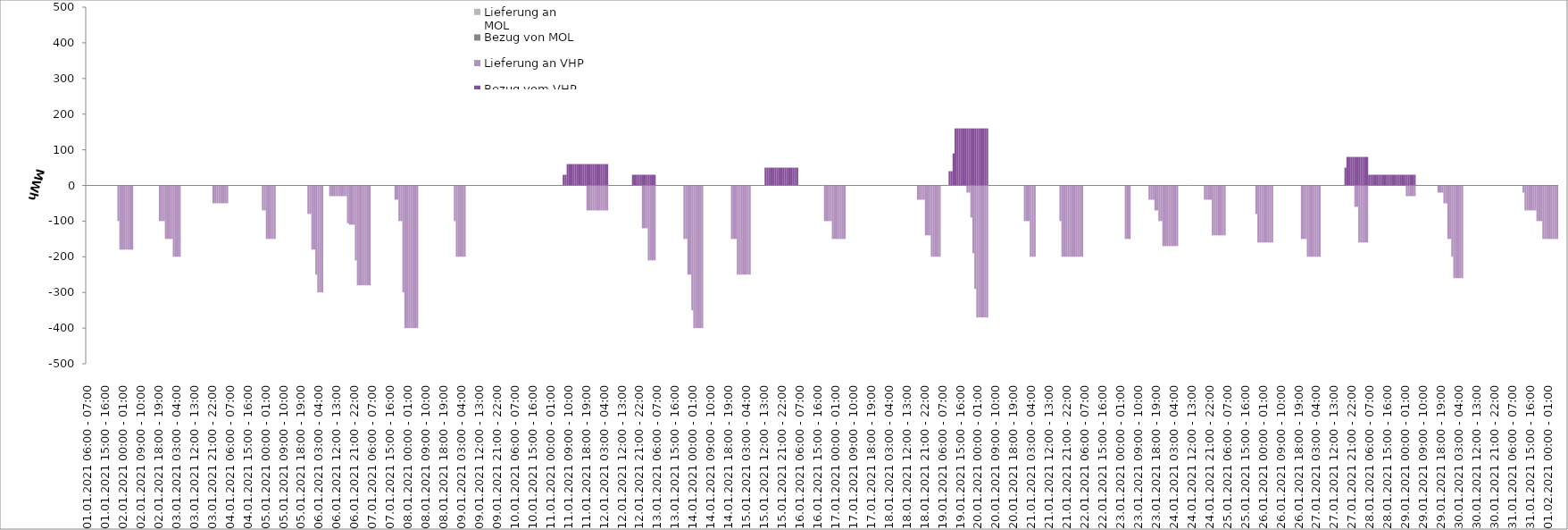
| Category | Bezug vom VHP | Lieferung an VHP | Bezug von MOL | Lieferung an MOL |
|---|---|---|---|---|
| 01.01.2021 06:00 - 07:00 | 0 | 0 | 0 | 0 |
| 01.01.2021 07:00 - 08:00 | 0 | 0 | 0 | 0 |
| 01.01.2021 08:00 - 09:00 | 0 | 0 | 0 | 0 |
| 01.01.2021 09:00 - 10:00 | 0 | 0 | 0 | 0 |
| 01.01.2021 10:00 - 11:00 | 0 | 0 | 0 | 0 |
| 01.01.2021 11:00 - 12:00 | 0 | 0 | 0 | 0 |
| 01.01.2021 12:00 - 13:00 | 0 | 0 | 0 | 0 |
| 01.01.2021 13:00 - 14:00 | 0 | 0 | 0 | 0 |
| 01.01.2021 14:00 - 15:00 | 0 | 0 | 0 | 0 |
| 01.01.2021 15:00 - 16:00 | 0 | 0 | 0 | 0 |
| 01.01.2021 16:00 - 17:00 | 0 | 0 | 0 | 0 |
| 01.01.2021 17:00 - 18:00 | 0 | 0 | 0 | 0 |
| 01.01.2021 18:00 - 19:00 | 0 | 0 | 0 | 0 |
| 01.01.2021 19:00 - 20:00 | 0 | 0 | 0 | 0 |
| 01.01.2021 20:00 - 21:00 | 0 | 0 | 0 | 0 |
| 01.01.2021 21:00 - 22:00 | 0 | 0 | 0 | 0 |
| 01.01.2021 22:00 - 23:00 | 0 | -100 | 0 | 0 |
| 01.01.2021 23:00 - 24:00 | 0 | -180 | 0 | 0 |
| 02.01.2021 00:00 - 01:00 | 0 | -180 | 0 | 0 |
| 02.01.2021 01:00 - 02:00 | 0 | -180 | 0 | 0 |
| 02.01.2021 02:00 - 03:00 | 0 | -180 | 0 | 0 |
| 02.01.2021 03:00 - 04:00 | 0 | -180 | 0 | 0 |
| 02.01.2021 04:00 - 05:00 | 0 | -180 | 0 | 0 |
| 02.01.2021 05:00 - 06:00 | 0 | -180 | 0 | 0 |
| 02.01.2021 06:00 - 07:00 | 0 | 0 | 0 | 0 |
| 02.01.2021 07:00 - 08:00 | 0 | 0 | 0 | 0 |
| 02.01.2021 08:00 - 09:00 | 0 | 0 | 0 | 0 |
| 02.01.2021 09:00 - 10:00 | 0 | 0 | 0 | 0 |
| 02.01.2021 10:00 - 11:00 | 0 | 0 | 0 | 0 |
| 02.01.2021 11:00 - 12:00 | 0 | 0 | 0 | 0 |
| 02.01.2021 12:00 - 13:00 | 0 | 0 | 0 | 0 |
| 02.01.2021 13:00 - 14:00 | 0 | 0 | 0 | 0 |
| 02.01.2021 14:00 - 15:00 | 0 | 0 | 0 | 0 |
| 02.01.2021 15:00 - 16:00 | 0 | 0 | 0 | 0 |
| 02.01.2021 16:00 - 17:00 | 0 | 0 | 0 | 0 |
| 02.01.2021 17:00 - 18:00 | 0 | 0 | 0 | 0 |
| 02.01.2021 18:00 - 19:00 | 0 | 0 | 0 | 0 |
| 02.01.2021 19:00 - 20:00 | 0 | -100 | 0 | 0 |
| 02.01.2021 20:00 - 21:00 | 0 | -100 | 0 | 0 |
| 02.01.2021 21:00 - 22:00 | 0 | -100 | 0 | 0 |
| 02.01.2021 22:00 - 23:00 | 0 | -150 | 0 | 0 |
| 02.01.2021 23:00 - 24:00 | 0 | -150 | 0 | 0 |
| 03.01.2021 00:00 - 01:00 | 0 | -150 | 0 | 0 |
| 03.01.2021 01:00 - 02:00 | 0 | -150 | 0 | 0 |
| 03.01.2021 02:00 - 03:00 | 0 | -200 | 0 | 0 |
| 03.01.2021 03:00 - 04:00 | 0 | -200 | 0 | 0 |
| 03.01.2021 04:00 - 05:00 | 0 | -200 | 0 | 0 |
| 03.01.2021 05:00 - 06:00 | 0 | -200 | 0 | 0 |
| 03.01.2021 06:00 - 07:00 | 0 | 0 | 0 | 0 |
| 03.01.2021 07:00 - 08:00 | 0 | 0 | 0 | 0 |
| 03.01.2021 08:00 - 09:00 | 0 | 0 | 0 | 0 |
| 03.01.2021 09:00 - 10:00 | 0 | 0 | 0 | 0 |
| 03.01.2021 10:00 - 11:00 | 0 | 0 | 0 | 0 |
| 03.01.2021 11:00 - 12:00 | 0 | 0 | 0 | 0 |
| 03.01.2021 12:00 - 13:00 | 0 | 0 | 0 | 0 |
| 03.01.2021 13:00 - 14:00 | 0 | 0 | 0 | 0 |
| 03.01.2021 14:00 - 15:00 | 0 | 0 | 0 | 0 |
| 03.01.2021 15:00 - 16:00 | 0 | 0 | 0 | 0 |
| 03.01.2021 16:00 - 17:00 | 0 | 0 | 0 | 0 |
| 03.01.2021 17:00 - 18:00 | 0 | 0 | 0 | 0 |
| 03.01.2021 18:00 - 19:00 | 0 | 0 | 0 | 0 |
| 03.01.2021 19:00 - 20:00 | 0 | 0 | 0 | 0 |
| 03.01.2021 20:00 - 21:00 | 0 | 0 | 0 | 0 |
| 03.01.2021 21:00 - 22:00 | 0 | 0 | 0 | 0 |
| 03.01.2021 22:00 - 23:00 | 0 | -50 | 0 | 0 |
| 03.01.2021 23:00 - 24:00 | 0 | -50 | 0 | 0 |
| 04.01.2021 00:00 - 01:00 | 0 | -50 | 0 | 0 |
| 04.01.2021 01:00 - 02:00 | 0 | -50 | 0 | 0 |
| 04.01.2021 02:00 - 03:00 | 0 | -50 | 0 | 0 |
| 04.01.2021 03:00 - 04:00 | 0 | -50 | 0 | 0 |
| 04.01.2021 04:00 - 05:00 | 0 | -50 | 0 | 0 |
| 04.01.2021 05:00 - 06:00 | 0 | -50 | 0 | 0 |
| 04.01.2021 06:00 - 07:00 | 0 | 0 | 0 | 0 |
| 04.01.2021 07:00 - 08:00 | 0 | 0 | 0 | 0 |
| 04.01.2021 08:00 - 09:00 | 0 | 0 | 0 | 0 |
| 04.01.2021 09:00 - 10:00 | 0 | 0 | 0 | 0 |
| 04.01.2021 10:00 - 11:00 | 0 | 0 | 0 | 0 |
| 04.01.2021 11:00 - 12:00 | 0 | 0 | 0 | 0 |
| 04.01.2021 12:00 - 13:00 | 0 | 0 | 0 | 0 |
| 04.01.2021 13:00 - 14:00 | 0 | 0 | 0 | 0 |
| 04.01.2021 14:00 - 15:00 | 0 | 0 | 0 | 0 |
| 04.01.2021 15:00 - 16:00 | 0 | 0 | 0 | 0 |
| 04.01.2021 16:00 - 17:00 | 0 | 0 | 0 | 0 |
| 04.01.2021 17:00 - 18:00 | 0 | 0 | 0 | 0 |
| 04.01.2021 18:00 - 19:00 | 0 | 0 | 0 | 0 |
| 04.01.2021 19:00 - 20:00 | 0 | 0 | 0 | 0 |
| 04.01.2021 20:00 - 21:00 | 0 | 0 | 0 | 0 |
| 04.01.2021 21:00 - 22:00 | 0 | 0 | 0 | 0 |
| 04.01.2021 22:00 - 23:00 | 0 | 0 | 0 | 0 |
| 04.01.2021 23:00 - 24:00 | 0 | -70 | 0 | 0 |
| 05.01.2021 00:00 - 01:00 | 0 | -70 | 0 | 0 |
| 05.01.2021 01:00 - 02:00 | 0 | -150 | 0 | 0 |
| 05.01.2021 02:00 - 03:00 | 0 | -150 | 0 | 0 |
| 05.01.2021 03:00 - 04:00 | 0 | -150 | 0 | 0 |
| 05.01.2021 04:00 - 05:00 | 0 | -150 | 0 | 0 |
| 05.01.2021 05:00 - 06:00 | 0 | -150 | 0 | 0 |
| 05.01.2021 06:00 - 07:00 | 0 | 0 | 0 | 0 |
| 05.01.2021 07:00 - 08:00 | 0 | 0 | 0 | 0 |
| 05.01.2021 08:00 - 09:00 | 0 | 0 | 0 | 0 |
| 05.01.2021 09:00 - 10:00 | 0 | 0 | 0 | 0 |
| 05.01.2021 10:00 - 11:00 | 0 | 0 | 0 | 0 |
| 05.01.2021 11:00 - 12:00 | 0 | 0 | 0 | 0 |
| 05.01.2021 12:00 - 13:00 | 0 | 0 | 0 | 0 |
| 05.01.2021 13:00 - 14:00 | 0 | 0 | 0 | 0 |
| 05.01.2021 14:00 - 15:00 | 0 | 0 | 0 | 0 |
| 05.01.2021 15:00 - 16:00 | 0 | 0 | 0 | 0 |
| 05.01.2021 16:00 - 17:00 | 0 | 0 | 0 | 0 |
| 05.01.2021 17:00 - 18:00 | 0 | 0 | 0 | 0 |
| 05.01.2021 18:00 - 19:00 | 0 | 0 | 0 | 0 |
| 05.01.2021 19:00 - 20:00 | 0 | 0 | 0 | 0 |
| 05.01.2021 20:00 - 21:00 | 0 | 0 | 0 | 0 |
| 05.01.2021 21:00 - 22:00 | 0 | 0 | 0 | 0 |
| 05.01.2021 22:00 - 23:00 | 0 | -80 | 0 | 0 |
| 05.01.2021 23:00 - 24:00 | 0 | -80 | 0 | 0 |
| 06.01.2021 00:00 - 01:00 | 0 | -180 | 0 | 0 |
| 06.01.2021 01:00 - 02:00 | 0 | -180 | 0 | 0 |
| 06.01.2021 02:00 - 03:00 | 0 | -250 | 0 | 0 |
| 06.01.2021 03:00 - 04:00 | 0 | -300 | 0 | 0 |
| 06.01.2021 04:00 - 05:00 | 0 | -300 | 0 | 0 |
| 06.01.2021 05:00 - 06:00 | 0 | -300 | 0 | 0 |
| 06.01.2021 06:00 - 07:00 | 0 | 0 | 0 | 0 |
| 06.01.2021 07:00 - 08:00 | 0 | 0 | 0 | 0 |
| 06.01.2021 08:00 - 09:00 | 0 | 0 | 0 | 0 |
| 06.01.2021 09:00 - 10:00 | 0 | -30 | 0 | 0 |
| 06.01.2021 10:00 - 11:00 | 0 | -30 | 0 | 0 |
| 06.01.2021 11:00 - 12:00 | 0 | -30 | 0 | 0 |
| 06.01.2021 12:00 - 13:00 | 0 | -30 | 0 | 0 |
| 06.01.2021 13:00 - 14:00 | 0 | -30 | 0 | 0 |
| 06.01.2021 14:00 - 15:00 | 0 | -30 | 0 | 0 |
| 06.01.2021 15:00 - 16:00 | 0 | -30 | 0 | 0 |
| 06.01.2021 16:00 - 17:00 | 0 | -30 | 0 | 0 |
| 06.01.2021 17:00 - 18:00 | 0 | -30 | 0 | 0 |
| 06.01.2021 18:00 - 19:00 | 0 | -106 | 0 | 0 |
| 06.01.2021 19:00 - 20:00 | 0 | -110 | 0 | 0 |
| 06.01.2021 20:00 - 21:00 | 0 | -110 | 0 | 0 |
| 06.01.2021 21:00 - 22:00 | 0 | -110 | 0 | 0 |
| 06.01.2021 22:00 - 23:00 | 0 | -210 | 0 | 0 |
| 06.01.2021 23:00 - 24:00 | 0 | -280 | 0 | 0 |
| 07.01.2021 00:00 - 01:00 | 0 | -280 | 0 | 0 |
| 07.01.2021 01:00 - 02:00 | 0 | -280 | 0 | 0 |
| 07.01.2021 02:00 - 03:00 | 0 | -280 | 0 | 0 |
| 07.01.2021 03:00 - 04:00 | 0 | -280 | 0 | 0 |
| 07.01.2021 04:00 - 05:00 | 0 | -280 | 0 | 0 |
| 07.01.2021 05:00 - 06:00 | 0 | -280 | 0 | 0 |
| 07.01.2021 06:00 - 07:00 | 0 | 0 | 0 | 0 |
| 07.01.2021 07:00 - 08:00 | 0 | 0 | 0 | 0 |
| 07.01.2021 08:00 - 09:00 | 0 | 0 | 0 | 0 |
| 07.01.2021 09:00 - 10:00 | 0 | 0 | 0 | 0 |
| 07.01.2021 10:00 - 11:00 | 0 | 0 | 0 | 0 |
| 07.01.2021 11:00 - 12:00 | 0 | 0 | 0 | 0 |
| 07.01.2021 12:00 - 13:00 | 0 | 0 | 0 | 0 |
| 07.01.2021 13:00 - 14:00 | 0 | 0 | 0 | 0 |
| 07.01.2021 14:00 - 15:00 | 0 | 0 | 0 | 0 |
| 07.01.2021 15:00 - 16:00 | 0 | 0 | 0 | 0 |
| 07.01.2021 16:00 - 17:00 | 0 | 0 | 0 | 0 |
| 07.01.2021 17:00 - 18:00 | 0 | 0 | 0 | 0 |
| 07.01.2021 18:00 - 19:00 | 0 | -40 | 0 | 0 |
| 07.01.2021 19:00 - 20:00 | 0 | -40 | 0 | 0 |
| 07.01.2021 20:00 - 21:00 | 0 | -100 | 0 | 0 |
| 07.01.2021 21:00 - 22:00 | 0 | -100 | 0 | 0 |
| 07.01.2021 22:00 - 23:00 | 0 | -300 | 0 | 0 |
| 07.01.2021 23:00 - 24:00 | 0 | -400 | 0 | 0 |
| 08.01.2021 00:00 - 01:00 | 0 | -400 | 0 | 0 |
| 08.01.2021 01:00 - 02:00 | 0 | -400 | 0 | 0 |
| 08.01.2021 02:00 - 03:00 | 0 | -400 | 0 | 0 |
| 08.01.2021 03:00 - 04:00 | 0 | -400 | 0 | 0 |
| 08.01.2021 04:00 - 05:00 | 0 | -400 | 0 | 0 |
| 08.01.2021 05:00 - 06:00 | 0 | -400 | 0 | 0 |
| 08.01.2021 06:00 - 07:00 | 0 | 0 | 0 | 0 |
| 08.01.2021 07:00 - 08:00 | 0 | 0 | 0 | 0 |
| 08.01.2021 08:00 - 09:00 | 0 | 0 | 0 | 0 |
| 08.01.2021 09:00 - 10:00 | 0 | 0 | 0 | 0 |
| 08.01.2021 10:00 - 11:00 | 0 | 0 | 0 | 0 |
| 08.01.2021 11:00 - 12:00 | 0 | 0 | 0 | 0 |
| 08.01.2021 12:00 - 13:00 | 0 | 0 | 0 | 0 |
| 08.01.2021 13:00 - 14:00 | 0 | 0 | 0 | 0 |
| 08.01.2021 14:00 - 15:00 | 0 | 0 | 0 | 0 |
| 08.01.2021 15:00 - 16:00 | 0 | 0 | 0 | 0 |
| 08.01.2021 16:00 - 17:00 | 0 | 0 | 0 | 0 |
| 08.01.2021 17:00 - 18:00 | 0 | 0 | 0 | 0 |
| 08.01.2021 18:00 - 19:00 | 0 | 0 | 0 | 0 |
| 08.01.2021 19:00 - 20:00 | 0 | 0 | 0 | 0 |
| 08.01.2021 20:00 - 21:00 | 0 | 0 | 0 | 0 |
| 08.01.2021 21:00 - 22:00 | 0 | 0 | 0 | 0 |
| 08.01.2021 22:00 - 23:00 | 0 | 0 | 0 | 0 |
| 08.01.2021 23:00 - 24:00 | 0 | 0 | 0 | 0 |
| 09.01.2021 00:00 - 01:00 | 0 | -100 | 0 | 0 |
| 09.01.2021 01:00 - 02:00 | 0 | -200 | 0 | 0 |
| 09.01.2021 02:00 - 03:00 | 0 | -200 | 0 | 0 |
| 09.01.2021 03:00 - 04:00 | 0 | -200 | 0 | 0 |
| 09.01.2021 04:00 - 05:00 | 0 | -200 | 0 | 0 |
| 09.01.2021 05:00 - 06:00 | 0 | -200 | 0 | 0 |
| 09.01.2021 06:00 - 07:00 | 0 | 0 | 0 | 0 |
| 09.01.2021 07:00 - 08:00 | 0 | 0 | 0 | 0 |
| 09.01.2021 08:00 - 09:00 | 0 | 0 | 0 | 0 |
| 09.01.2021 09:00 - 10:00 | 0 | 0 | 0 | 0 |
| 09.01.2021 10:00 - 11:00 | 0 | 0 | 0 | 0 |
| 09.01.2021 11:00 - 12:00 | 0 | 0 | 0 | 0 |
| 09.01.2021 12:00 - 13:00 | 0 | 0 | 0 | 0 |
| 09.01.2021 13:00 - 14:00 | 0 | 0 | 0 | 0 |
| 09.01.2021 14:00 - 15:00 | 0 | 0 | 0 | 0 |
| 09.01.2021 15:00 - 16:00 | 0 | 0 | 0 | 0 |
| 09.01.2021 16:00 - 17:00 | 0 | 0 | 0 | 0 |
| 09.01.2021 17:00 - 18:00 | 0 | 0 | 0 | 0 |
| 09.01.2021 18:00 - 19:00 | 0 | 0 | 0 | 0 |
| 09.01.2021 19:00 - 20:00 | 0 | 0 | 0 | 0 |
| 09.01.2021 20:00 - 21:00 | 0 | 0 | 0 | 0 |
| 09.01.2021 21:00 - 22:00 | 0 | 0 | 0 | 0 |
| 09.01.2021 22:00 - 23:00 | 0 | 0 | 0 | 0 |
| 09.01.2021 23:00 - 24:00 | 0 | 0 | 0 | 0 |
| 10.01.2021 00:00 - 01:00 | 0 | 0 | 0 | 0 |
| 10.01.2021 01:00 - 02:00 | 0 | 0 | 0 | 0 |
| 10.01.2021 02:00 - 03:00 | 0 | 0 | 0 | 0 |
| 10.01.2021 03:00 - 04:00 | 0 | 0 | 0 | 0 |
| 10.01.2021 04:00 - 05:00 | 0 | 0 | 0 | 0 |
| 10.01.2021 05:00 - 06:00 | 0 | 0 | 0 | 0 |
| 10.01.2021 06:00 - 07:00 | 0 | 0 | 0 | 0 |
| 10.01.2021 07:00 - 08:00 | 0 | 0 | 0 | 0 |
| 10.01.2021 08:00 - 09:00 | 0 | 0 | 0 | 0 |
| 10.01.2021 09:00 - 10:00 | 0 | 0 | 0 | 0 |
| 10.01.2021 10:00 - 11:00 | 0 | 0 | 0 | 0 |
| 10.01.2021 11:00 - 12:00 | 0 | 0 | 0 | 0 |
| 10.01.2021 12:00 - 13:00 | 0 | 0 | 0 | 0 |
| 10.01.2021 13:00 - 14:00 | 0 | 0 | 0 | 0 |
| 10.01.2021 14:00 - 15:00 | 0 | 0 | 0 | 0 |
| 10.01.2021 15:00 - 16:00 | 0 | 0 | 0 | 0 |
| 10.01.2021 16:00 - 17:00 | 0 | 0 | 0 | 0 |
| 10.01.2021 17:00 - 18:00 | 0 | 0 | 0 | 0 |
| 10.01.2021 18:00 - 19:00 | 0 | 0 | 0 | 0 |
| 10.01.2021 19:00 - 20:00 | 0 | 0 | 0 | 0 |
| 10.01.2021 20:00 - 21:00 | 0 | 0 | 0 | 0 |
| 10.01.2021 21:00 - 22:00 | 0 | 0 | 0 | 0 |
| 10.01.2021 22:00 - 23:00 | 0 | 0 | 0 | 0 |
| 10.01.2021 23:00 - 24:00 | 0 | 0 | 0 | 0 |
| 11.01.2021 00:00 - 01:00 | 0 | 0 | 0 | 0 |
| 11.01.2021 01:00 - 02:00 | 0 | 0 | 0 | 0 |
| 11.01.2021 02:00 - 03:00 | 0 | 0 | 0 | 0 |
| 11.01.2021 03:00 - 04:00 | 0 | 0 | 0 | 0 |
| 11.01.2021 04:00 - 05:00 | 0 | 0 | 0 | 0 |
| 11.01.2021 05:00 - 06:00 | 0 | 0 | 0 | 0 |
| 11.01.2021 06:00 - 07:00 | 0 | 0 | 0 | 0 |
| 11.01.2021 07:00 - 08:00 | 30 | 0 | 0 | 0 |
| 11.01.2021 08:00 - 09:00 | 30 | 0 | 0 | 0 |
| 11.01.2021 09:00 - 10:00 | 60 | 0 | 0 | 0 |
| 11.01.2021 10:00 - 11:00 | 60 | 0 | 0 | 0 |
| 11.01.2021 11:00 - 12:00 | 60 | 0 | 0 | 0 |
| 11.01.2021 12:00 - 13:00 | 60 | 0 | 0 | 0 |
| 11.01.2021 13:00 - 14:00 | 60 | 0 | 0 | 0 |
| 11.01.2021 14:00 - 15:00 | 60 | 0 | 0 | 0 |
| 11.01.2021 15:00 - 16:00 | 60 | 0 | 0 | 0 |
| 11.01.2021 16:00 - 17:00 | 60 | 0 | 0 | 0 |
| 11.01.2021 17:00 - 18:00 | 60 | 0 | 0 | 0 |
| 11.01.2021 18:00 - 19:00 | 60 | 0 | 0 | 0 |
| 11.01.2021 19:00 - 20:00 | 60 | -70 | 0 | 0 |
| 11.01.2021 20:00 - 21:00 | 60 | -70 | 0 | 0 |
| 11.01.2021 21:00 - 22:00 | 60 | -70 | 0 | 0 |
| 11.01.2021 22:00 - 23:00 | 60 | -70 | 0 | 0 |
| 11.01.2021 23:00 - 24:00 | 60 | -70 | 0 | 0 |
| 12.01.2021 00:00 - 01:00 | 60 | -70 | 0 | 0 |
| 12.01.2021 01:00 - 02:00 | 60 | -70 | 0 | 0 |
| 12.01.2021 02:00 - 03:00 | 60 | -70 | 0 | 0 |
| 12.01.2021 03:00 - 04:00 | 60 | -70 | 0 | 0 |
| 12.01.2021 04:00 - 05:00 | 60 | -70 | 0 | 0 |
| 12.01.2021 05:00 - 06:00 | 60 | -70 | 0 | 0 |
| 12.01.2021 06:00 - 07:00 | 0 | 0 | 0 | 0 |
| 12.01.2021 07:00 - 08:00 | 0 | 0 | 0 | 0 |
| 12.01.2021 08:00 - 09:00 | 0 | 0 | 0 | 0 |
| 12.01.2021 09:00 - 10:00 | 0 | 0 | 0 | 0 |
| 12.01.2021 10:00 - 11:00 | 0 | 0 | 0 | 0 |
| 12.01.2021 11:00 - 12:00 | 0 | 0 | 0 | 0 |
| 12.01.2021 12:00 - 13:00 | 0 | 0 | 0 | 0 |
| 12.01.2021 13:00 - 14:00 | 0 | 0 | 0 | 0 |
| 12.01.2021 14:00 - 15:00 | 0 | 0 | 0 | 0 |
| 12.01.2021 15:00 - 16:00 | 0 | 0 | 0 | 0 |
| 12.01.2021 16:00 - 17:00 | 0 | 0 | 0 | 0 |
| 12.01.2021 17:00 - 18:00 | 0 | 0 | 0 | 0 |
| 12.01.2021 18:00 - 19:00 | 30 | 0 | 0 | 0 |
| 12.01.2021 19:00 - 20:00 | 30 | 0 | 0 | 0 |
| 12.01.2021 20:00 - 21:00 | 30 | 0 | 0 | 0 |
| 12.01.2021 21:00 - 22:00 | 30 | 0 | 0 | 0 |
| 12.01.2021 22:00 - 23:00 | 30 | 0 | 0 | 0 |
| 12.01.2021 23:00 - 24:00 | 30 | -120 | 0 | 0 |
| 13.01.2021 00:00 - 01:00 | 30 | -120 | 0 | 0 |
| 13.01.2021 01:00 - 02:00 | 30 | -120 | 0 | 0 |
| 13.01.2021 02:00 - 03:00 | 30 | -210 | 0 | 0 |
| 13.01.2021 03:00 - 04:00 | 30 | -210 | 0 | 0 |
| 13.01.2021 04:00 - 05:00 | 30 | -210 | 0 | 0 |
| 13.01.2021 05:00 - 06:00 | 30 | -210 | 0 | 0 |
| 13.01.2021 06:00 - 07:00 | 0 | 0 | 0 | 0 |
| 13.01.2021 07:00 - 08:00 | 0 | 0 | 0 | 0 |
| 13.01.2021 08:00 - 09:00 | 0 | 0 | 0 | 0 |
| 13.01.2021 09:00 - 10:00 | 0 | 0 | 0 | 0 |
| 13.01.2021 10:00 - 11:00 | 0 | 0 | 0 | 0 |
| 13.01.2021 11:00 - 12:00 | 0 | 0 | 0 | 0 |
| 13.01.2021 12:00 - 13:00 | 0 | 0 | 0 | 0 |
| 13.01.2021 13:00 - 14:00 | 0 | 0 | 0 | 0 |
| 13.01.2021 14:00 - 15:00 | 0 | 0 | 0 | 0 |
| 13.01.2021 15:00 - 16:00 | 0 | 0 | 0 | 0 |
| 13.01.2021 16:00 - 17:00 | 0 | 0 | 0 | 0 |
| 13.01.2021 17:00 - 18:00 | 0 | 0 | 0 | 0 |
| 13.01.2021 18:00 - 19:00 | 0 | 0 | 0 | 0 |
| 13.01.2021 19:00 - 20:00 | 0 | 0 | 0 | 0 |
| 13.01.2021 20:00 - 21:00 | 0 | -150 | 0 | 0 |
| 13.01.2021 21:00 - 22:00 | 0 | -150 | 0 | 0 |
| 13.01.2021 22:00 - 23:00 | 0 | -250 | 0 | 0 |
| 13.01.2021 23:00 - 24:00 | 0 | -250 | 0 | 0 |
| 14.01.2021 00:00 - 01:00 | 0 | -350 | 0 | 0 |
| 14.01.2021 01:00 - 02:00 | 0 | -400 | 0 | 0 |
| 14.01.2021 02:00 - 03:00 | 0 | -400 | 0 | 0 |
| 14.01.2021 03:00 - 04:00 | 0 | -400 | 0 | 0 |
| 14.01.2021 04:00 - 05:00 | 0 | -400 | 0 | 0 |
| 14.01.2021 05:00 - 06:00 | 0 | -400 | 0 | 0 |
| 14.01.2021 06:00 - 07:00 | 0 | 0 | 0 | 0 |
| 14.01.2021 07:00 - 08:00 | 0 | 0 | 0 | 0 |
| 14.01.2021 08:00 - 09:00 | 0 | 0 | 0 | 0 |
| 14.01.2021 09:00 - 10:00 | 0 | 0 | 0 | 0 |
| 14.01.2021 10:00 - 11:00 | 0 | 0 | 0 | 0 |
| 14.01.2021 11:00 - 12:00 | 0 | 0 | 0 | 0 |
| 14.01.2021 12:00 - 13:00 | 0 | 0 | 0 | 0 |
| 14.01.2021 13:00 - 14:00 | 0 | 0 | 0 | 0 |
| 14.01.2021 14:00 - 15:00 | 0 | 0 | 0 | 0 |
| 14.01.2021 15:00 - 16:00 | 0 | 0 | 0 | 0 |
| 14.01.2021 16:00 - 17:00 | 0 | 0 | 0 | 0 |
| 14.01.2021 17:00 - 18:00 | 0 | 0 | 0 | 0 |
| 14.01.2021 18:00 - 19:00 | 0 | 0 | 0 | 0 |
| 14.01.2021 19:00 - 20:00 | 0 | 0 | 0 | 0 |
| 14.01.2021 20:00 - 21:00 | 0 | -150 | 0 | 0 |
| 14.01.2021 21:00 - 22:00 | 0 | -150 | 0 | 0 |
| 14.01.2021 22:00 - 23:00 | 0 | -150 | 0 | 0 |
| 14.01.2021 23:00 - 24:00 | 0 | -250 | 0 | 0 |
| 15.01.2021 00:00 - 01:00 | 0 | -250 | 0 | 0 |
| 15.01.2021 01:00 - 02:00 | 0 | -250 | 0 | 0 |
| 15.01.2021 02:00 - 03:00 | 0 | -250 | 0 | 0 |
| 15.01.2021 03:00 - 04:00 | 0 | -250 | 0 | 0 |
| 15.01.2021 04:00 - 05:00 | 0 | -250 | 0 | 0 |
| 15.01.2021 05:00 - 06:00 | 0 | -250 | 0 | 0 |
| 15.01.2021 06:00 - 07:00 | 0 | 0 | 0 | 0 |
| 15.01.2021 07:00 - 08:00 | 0 | 0 | 0 | 0 |
| 15.01.2021 08:00 - 09:00 | 0 | 0 | 0 | 0 |
| 15.01.2021 09:00 - 10:00 | 0 | 0 | 0 | 0 |
| 15.01.2021 10:00 - 11:00 | 0 | 0 | 0 | 0 |
| 15.01.2021 11:00 - 12:00 | 0 | 0 | 0 | 0 |
| 15.01.2021 12:00 - 13:00 | 0 | 0 | 0 | 0 |
| 15.01.2021 13:00 - 14:00 | 50 | 0 | 0 | 0 |
| 15.01.2021 14:00 - 15:00 | 50 | 0 | 0 | 0 |
| 15.01.2021 15:00 - 16:00 | 50 | 0 | 0 | 0 |
| 15.01.2021 16:00 - 17:00 | 50 | 0 | 0 | 0 |
| 15.01.2021 17:00 - 18:00 | 50 | 0 | 0 | 0 |
| 15.01.2021 18:00 - 19:00 | 50 | 0 | 0 | 0 |
| 15.01.2021 19:00 - 20:00 | 50 | 0 | 0 | 0 |
| 15.01.2021 20:00 - 21:00 | 50 | 0 | 0 | 0 |
| 15.01.2021 21:00 - 22:00 | 50 | 0 | 0 | 0 |
| 15.01.2021 22:00 - 23:00 | 50 | 0 | 0 | 0 |
| 15.01.2021 23:00 - 24:00 | 50 | 0 | 0 | 0 |
| 16.01.2021 00:00 - 01:00 | 50 | 0 | 0 | 0 |
| 16.01.2021 01:00 - 02:00 | 50 | 0 | 0 | 0 |
| 16.01.2021 02:00 - 03:00 | 50 | 0 | 0 | 0 |
| 16.01.2021 03:00 - 04:00 | 50 | 0 | 0 | 0 |
| 16.01.2021 04:00 - 05:00 | 50 | 0 | 0 | 0 |
| 16.01.2021 05:00 - 06:00 | 50 | 0 | 0 | 0 |
| 16.01.2021 06:00 - 07:00 | 0 | 0 | 0 | 0 |
| 16.01.2021 07:00 - 08:00 | 0 | 0 | 0 | 0 |
| 16.01.2021 08:00 - 09:00 | 0 | 0 | 0 | 0 |
| 16.01.2021 09:00 - 10:00 | 0 | 0 | 0 | 0 |
| 16.01.2021 10:00 - 11:00 | 0 | 0 | 0 | 0 |
| 16.01.2021 11:00 - 12:00 | 0 | 0 | 0 | 0 |
| 16.01.2021 12:00 - 13:00 | 0 | 0 | 0 | 0 |
| 16.01.2021 13:00 - 14:00 | 0 | 0 | 0 | 0 |
| 16.01.2021 14:00 - 15:00 | 0 | 0 | 0 | 0 |
| 16.01.2021 15:00 - 16:00 | 0 | 0 | 0 | 0 |
| 16.01.2021 16:00 - 17:00 | 0 | 0 | 0 | 0 |
| 16.01.2021 17:00 - 18:00 | 0 | 0 | 0 | 0 |
| 16.01.2021 18:00 - 19:00 | 0 | 0 | 0 | 0 |
| 16.01.2021 19:00 - 20:00 | 0 | -100 | 0 | 0 |
| 16.01.2021 20:00 - 21:00 | 0 | -100 | 0 | 0 |
| 16.01.2021 21:00 - 22:00 | 0 | -100 | 0 | 0 |
| 16.01.2021 22:00 - 23:00 | 0 | -100 | 0 | 0 |
| 16.01.2021 23:00 - 24:00 | 0 | -150 | 0 | 0 |
| 17.01.2021 00:00 - 01:00 | 0 | -150 | 0 | 0 |
| 17.01.2021 01:00 - 02:00 | 0 | -150 | 0 | 0 |
| 17.01.2021 02:00 - 03:00 | 0 | -150 | 0 | 0 |
| 17.01.2021 03:00 - 04:00 | 0 | -150 | 0 | 0 |
| 17.01.2021 04:00 - 05:00 | 0 | -150 | 0 | 0 |
| 17.01.2021 05:00 - 06:00 | 0 | -150 | 0 | 0 |
| 17.01.2021 06:00 - 07:00 | 0 | 0 | 0 | 0 |
| 17.01.2021 07:00 - 08:00 | 0 | 0 | 0 | 0 |
| 17.01.2021 08:00 - 09:00 | 0 | 0 | 0 | 0 |
| 17.01.2021 09:00 - 10:00 | 0 | 0 | 0 | 0 |
| 17.01.2021 10:00 - 11:00 | 0 | 0 | 0 | 0 |
| 17.01.2021 11:00 - 12:00 | 0 | 0 | 0 | 0 |
| 17.01.2021 12:00 - 13:00 | 0 | 0 | 0 | 0 |
| 17.01.2021 13:00 - 14:00 | 0 | 0 | 0 | 0 |
| 17.01.2021 14:00 - 15:00 | 0 | 0 | 0 | 0 |
| 17.01.2021 15:00 - 16:00 | 0 | 0 | 0 | 0 |
| 17.01.2021 16:00 - 17:00 | 0 | 0 | 0 | 0 |
| 17.01.2021 17:00 - 18:00 | 0 | 0 | 0 | 0 |
| 17.01.2021 18:00 - 19:00 | 0 | 0 | 0 | 0 |
| 17.01.2021 19:00 - 20:00 | 0 | 0 | 0 | 0 |
| 17.01.2021 20:00 - 21:00 | 0 | 0 | 0 | 0 |
| 17.01.2021 21:00 - 22:00 | 0 | 0 | 0 | 0 |
| 17.01.2021 22:00 - 23:00 | 0 | 0 | 0 | 0 |
| 17.01.2021 23:00 - 24:00 | 0 | 0 | 0 | 0 |
| 18.01.2021 00:00 - 01:00 | 0 | 0 | 0 | 0 |
| 18.01.2021 01:00 - 02:00 | 0 | 0 | 0 | 0 |
| 18.01.2021 02:00 - 03:00 | 0 | 0 | 0 | 0 |
| 18.01.2021 03:00 - 04:00 | 0 | 0 | 0 | 0 |
| 18.01.2021 04:00 - 05:00 | 0 | 0 | 0 | 0 |
| 18.01.2021 05:00 - 06:00 | 0 | 0 | 0 | 0 |
| 18.01.2021 06:00 - 07:00 | 0 | 0 | 0 | 0 |
| 18.01.2021 07:00 - 08:00 | 0 | 0 | 0 | 0 |
| 18.01.2021 08:00 - 09:00 | 0 | 0 | 0 | 0 |
| 18.01.2021 09:00 - 10:00 | 0 | 0 | 0 | 0 |
| 18.01.2021 10:00 - 11:00 | 0 | 0 | 0 | 0 |
| 18.01.2021 11:00 - 12:00 | 0 | 0 | 0 | 0 |
| 18.01.2021 12:00 - 13:00 | 0 | 0 | 0 | 0 |
| 18.01.2021 13:00 - 14:00 | 0 | 0 | 0 | 0 |
| 18.01.2021 14:00 - 15:00 | 0 | 0 | 0 | 0 |
| 18.01.2021 15:00 - 16:00 | 0 | 0 | 0 | 0 |
| 18.01.2021 16:00 - 17:00 | 0 | 0 | 0 | 0 |
| 18.01.2021 17:00 - 18:00 | 0 | 0 | 0 | 0 |
| 18.01.2021 18:00 - 19:00 | 0 | -40 | 0 | 0 |
| 18.01.2021 19:00 - 20:00 | 0 | -40 | 0 | 0 |
| 18.01.2021 20:00 - 21:00 | 0 | -40 | 0 | 0 |
| 18.01.2021 21:00 - 22:00 | 0 | -40 | 0 | 0 |
| 18.01.2021 22:00 - 23:00 | 0 | -140 | 0 | 0 |
| 18.01.2021 23:00 - 24:00 | 0 | -140 | 0 | 0 |
| 19.01.2021 00:00 - 01:00 | 0 | -140 | 0 | 0 |
| 19.01.2021 01:00 - 02:00 | 0 | -200 | 0 | 0 |
| 19.01.2021 02:00 - 03:00 | 0 | -200 | 0 | 0 |
| 19.01.2021 03:00 - 04:00 | 0 | -200 | 0 | 0 |
| 19.01.2021 04:00 - 05:00 | 0 | -200 | 0 | 0 |
| 19.01.2021 05:00 - 06:00 | 0 | -200 | 0 | 0 |
| 19.01.2021 06:00 - 07:00 | 0 | 0 | 0 | 0 |
| 19.01.2021 07:00 - 08:00 | 0 | 0 | 0 | 0 |
| 19.01.2021 08:00 - 09:00 | 0 | 0 | 0 | 0 |
| 19.01.2021 09:00 - 10:00 | 0 | 0 | 0 | 0 |
| 19.01.2021 10:00 - 11:00 | 40 | 0 | 0 | 0 |
| 19.01.2021 11:00 - 12:00 | 40 | 0 | 0 | 0 |
| 19.01.2021 12:00 - 13:00 | 90 | 0 | 0 | 0 |
| 19.01.2021 13:00 - 14:00 | 160 | 0 | 0 | 0 |
| 19.01.2021 14:00 - 15:00 | 160 | 0 | 0 | 0 |
| 19.01.2021 15:00 - 16:00 | 160 | 0 | 0 | 0 |
| 19.01.2021 16:00 - 17:00 | 160 | 0 | 0 | 0 |
| 19.01.2021 17:00 - 18:00 | 160 | 0 | 0 | 0 |
| 19.01.2021 18:00 - 19:00 | 160 | 0 | 0 | 0 |
| 19.01.2021 19:00 - 20:00 | 160 | -20 | 0 | 0 |
| 19.01.2021 20:00 - 21:00 | 160 | -20 | 0 | 0 |
| 19.01.2021 21:00 - 22:00 | 160 | -90 | 0 | 0 |
| 19.01.2021 22:00 - 23:00 | 160 | -190 | 0 | 0 |
| 19.01.2021 23:00 - 24:00 | 160 | -290 | 0 | 0 |
| 20.01.2021 00:00 - 01:00 | 160 | -370 | 0 | 0 |
| 20.01.2021 01:00 - 02:00 | 160 | -370 | 0 | 0 |
| 20.01.2021 02:00 - 03:00 | 160 | -370 | 0 | 0 |
| 20.01.2021 03:00 - 04:00 | 160 | -370 | 0 | 0 |
| 20.01.2021 04:00 - 05:00 | 160 | -370 | 0 | 0 |
| 20.01.2021 05:00 - 06:00 | 160 | -370 | 0 | 0 |
| 20.01.2021 06:00 - 07:00 | 0 | 0 | 0 | 0 |
| 20.01.2021 07:00 - 08:00 | 0 | 0 | 0 | 0 |
| 20.01.2021 08:00 - 09:00 | 0 | 0 | 0 | 0 |
| 20.01.2021 09:00 - 10:00 | 0 | 0 | 0 | 0 |
| 20.01.2021 10:00 - 11:00 | 0 | 0 | 0 | 0 |
| 20.01.2021 11:00 - 12:00 | 0 | 0 | 0 | 0 |
| 20.01.2021 12:00 - 13:00 | 0 | 0 | 0 | 0 |
| 20.01.2021 13:00 - 14:00 | 0 | 0 | 0 | 0 |
| 20.01.2021 14:00 - 15:00 | 0 | 0 | 0 | 0 |
| 20.01.2021 15:00 - 16:00 | 0 | 0 | 0 | 0 |
| 20.01.2021 16:00 - 17:00 | 0 | 0 | 0 | 0 |
| 20.01.2021 17:00 - 18:00 | 0 | 0 | 0 | 0 |
| 20.01.2021 18:00 - 19:00 | 0 | 0 | 0 | 0 |
| 20.01.2021 19:00 - 20:00 | 0 | 0 | 0 | 0 |
| 20.01.2021 20:00 - 21:00 | 0 | 0 | 0 | 0 |
| 20.01.2021 21:00 - 22:00 | 0 | 0 | 0 | 0 |
| 20.01.2021 22:00 - 23:00 | 0 | 0 | 0 | 0 |
| 20.01.2021 23:00 - 24:00 | 0 | 0 | 0 | 0 |
| 21.01.2021 00:00 - 01:00 | 0 | -100 | 0 | 0 |
| 21.01.2021 01:00 - 02:00 | 0 | -100 | 0 | 0 |
| 21.01.2021 02:00 - 03:00 | 0 | -100 | 0 | 0 |
| 21.01.2021 03:00 - 04:00 | 0 | -200 | 0 | 0 |
| 21.01.2021 04:00 - 05:00 | 0 | -200 | 0 | 0 |
| 21.01.2021 05:00 - 06:00 | 0 | -200 | 0 | 0 |
| 21.01.2021 06:00 - 07:00 | 0 | 0 | 0 | 0 |
| 21.01.2021 07:00 - 08:00 | 0 | 0 | 0 | 0 |
| 21.01.2021 08:00 - 09:00 | 0 | 0 | 0 | 0 |
| 21.01.2021 09:00 - 10:00 | 0 | 0 | 0 | 0 |
| 21.01.2021 10:00 - 11:00 | 0 | 0 | 0 | 0 |
| 21.01.2021 11:00 - 12:00 | 0 | 0 | 0 | 0 |
| 21.01.2021 12:00 - 13:00 | 0 | 0 | 0 | 0 |
| 21.01.2021 13:00 - 14:00 | 0 | 0 | 0 | 0 |
| 21.01.2021 14:00 - 15:00 | 0 | 0 | 0 | 0 |
| 21.01.2021 15:00 - 16:00 | 0 | 0 | 0 | 0 |
| 21.01.2021 16:00 - 17:00 | 0 | 0 | 0 | 0 |
| 21.01.2021 17:00 - 18:00 | 0 | 0 | 0 | 0 |
| 21.01.2021 18:00 - 19:00 | 0 | -100 | 0 | 0 |
| 21.01.2021 19:00 - 20:00 | 0 | -200 | 0 | 0 |
| 21.01.2021 20:00 - 21:00 | 0 | -200 | 0 | 0 |
| 21.01.2021 21:00 - 22:00 | 0 | -200 | 0 | 0 |
| 21.01.2021 22:00 - 23:00 | 0 | -200 | 0 | 0 |
| 21.01.2021 23:00 - 24:00 | 0 | -200 | 0 | 0 |
| 22.01.2021 00:00 - 01:00 | 0 | -200 | 0 | 0 |
| 22.01.2021 01:00 - 02:00 | 0 | -200 | 0 | 0 |
| 22.01.2021 02:00 - 03:00 | 0 | -200 | 0 | 0 |
| 22.01.2021 03:00 - 04:00 | 0 | -200 | 0 | 0 |
| 22.01.2021 04:00 - 05:00 | 0 | -200 | 0 | 0 |
| 22.01.2021 05:00 - 06:00 | 0 | -200 | 0 | 0 |
| 22.01.2021 06:00 - 07:00 | 0 | 0 | 0 | 0 |
| 22.01.2021 07:00 - 08:00 | 0 | 0 | 0 | 0 |
| 22.01.2021 08:00 - 09:00 | 0 | 0 | 0 | 0 |
| 22.01.2021 09:00 - 10:00 | 0 | 0 | 0 | 0 |
| 22.01.2021 10:00 - 11:00 | 0 | 0 | 0 | 0 |
| 22.01.2021 11:00 - 12:00 | 0 | 0 | 0 | 0 |
| 22.01.2021 12:00 - 13:00 | 0 | 0 | 0 | 0 |
| 22.01.2021 13:00 - 14:00 | 0 | 0 | 0 | 0 |
| 22.01.2021 14:00 - 15:00 | 0 | 0 | 0 | 0 |
| 22.01.2021 15:00 - 16:00 | 0 | 0 | 0 | 0 |
| 22.01.2021 16:00 - 17:00 | 0 | 0 | 0 | 0 |
| 22.01.2021 17:00 - 18:00 | 0 | 0 | 0 | 0 |
| 22.01.2021 18:00 - 19:00 | 0 | 0 | 0 | 0 |
| 22.01.2021 19:00 - 20:00 | 0 | 0 | 0 | 0 |
| 22.01.2021 20:00 - 21:00 | 0 | 0 | 0 | 0 |
| 22.01.2021 21:00 - 22:00 | 0 | 0 | 0 | 0 |
| 22.01.2021 22:00 - 23:00 | 0 | 0 | 0 | 0 |
| 22.01.2021 23:00 - 24:00 | 0 | 0 | 0 | 0 |
| 23.01.2021 00:00 - 01:00 | 0 | 0 | 0 | 0 |
| 23.01.2021 01:00 - 02:00 | 0 | 0 | 0 | 0 |
| 23.01.2021 02:00 - 03:00 | 0 | 0 | 0 | 0 |
| 23.01.2021 03:00 - 04:00 | 0 | -150 | 0 | 0 |
| 23.01.2021 04:00 - 05:00 | 0 | -150 | 0 | 0 |
| 23.01.2021 05:00 - 06:00 | 0 | -150 | 0 | 0 |
| 23.01.2021 06:00 - 07:00 | 0 | 0 | 0 | 0 |
| 23.01.2021 07:00 - 08:00 | 0 | 0 | 0 | 0 |
| 23.01.2021 08:00 - 09:00 | 0 | 0 | 0 | 0 |
| 23.01.2021 09:00 - 10:00 | 0 | 0 | 0 | 0 |
| 23.01.2021 10:00 - 11:00 | 0 | 0 | 0 | 0 |
| 23.01.2021 11:00 - 12:00 | 0 | 0 | 0 | 0 |
| 23.01.2021 12:00 - 13:00 | 0 | 0 | 0 | 0 |
| 23.01.2021 13:00 - 14:00 | 0 | 0 | 0 | 0 |
| 23.01.2021 14:00 - 15:00 | 0 | 0 | 0 | 0 |
| 23.01.2021 15:00 - 16:00 | 0 | -40 | 0 | 0 |
| 23.01.2021 16:00 - 17:00 | 0 | -40 | 0 | 0 |
| 23.01.2021 17:00 - 18:00 | 0 | -40 | 0 | 0 |
| 23.01.2021 18:00 - 19:00 | 0 | -70 | 0 | 0 |
| 23.01.2021 19:00 - 20:00 | 0 | -70 | 0 | 0 |
| 23.01.2021 20:00 - 21:00 | 0 | -100 | 0 | 0 |
| 23.01.2021 21:00 - 22:00 | 0 | -100 | 0 | 0 |
| 23.01.2021 22:00 - 23:00 | 0 | -170 | 0 | 0 |
| 23.01.2021 23:00 - 24:00 | 0 | -170 | 0 | 0 |
| 24.01.2021 00:00 - 01:00 | 0 | -170 | 0 | 0 |
| 24.01.2021 01:00 - 02:00 | 0 | -170 | 0 | 0 |
| 24.01.2021 02:00 - 03:00 | 0 | -170 | 0 | 0 |
| 24.01.2021 03:00 - 04:00 | 0 | -170 | 0 | 0 |
| 24.01.2021 04:00 - 05:00 | 0 | -170 | 0 | 0 |
| 24.01.2021 05:00 - 06:00 | 0 | -170 | 0 | 0 |
| 24.01.2021 06:00 - 07:00 | 0 | 0 | 0 | 0 |
| 24.01.2021 07:00 - 08:00 | 0 | 0 | 0 | 0 |
| 24.01.2021 08:00 - 09:00 | 0 | 0 | 0 | 0 |
| 24.01.2021 09:00 - 10:00 | 0 | 0 | 0 | 0 |
| 24.01.2021 10:00 - 11:00 | 0 | 0 | 0 | 0 |
| 24.01.2021 11:00 - 12:00 | 0 | 0 | 0 | 0 |
| 24.01.2021 12:00 - 13:00 | 0 | 0 | 0 | 0 |
| 24.01.2021 13:00 - 14:00 | 0 | 0 | 0 | 0 |
| 24.01.2021 14:00 - 15:00 | 0 | 0 | 0 | 0 |
| 24.01.2021 15:00 - 16:00 | 0 | 0 | 0 | 0 |
| 24.01.2021 16:00 - 17:00 | 0 | 0 | 0 | 0 |
| 24.01.2021 17:00 - 18:00 | 0 | 0 | 0 | 0 |
| 24.01.2021 18:00 - 19:00 | 0 | 0 | 0 | 0 |
| 24.01.2021 19:00 - 20:00 | 0 | -40 | 0 | 0 |
| 24.01.2021 20:00 - 21:00 | 0 | -40 | 0 | 0 |
| 24.01.2021 21:00 - 22:00 | 0 | -40 | 0 | 0 |
| 24.01.2021 22:00 - 23:00 | 0 | -40 | 0 | 0 |
| 24.01.2021 23:00 - 24:00 | 0 | -140 | 0 | 0 |
| 25.01.2021 00:00 - 01:00 | 0 | -140 | 0 | 0 |
| 25.01.2021 01:00 - 02:00 | 0 | -140 | 0 | 0 |
| 25.01.2021 02:00 - 03:00 | 0 | -140 | 0 | 0 |
| 25.01.2021 03:00 - 04:00 | 0 | -140 | 0 | 0 |
| 25.01.2021 04:00 - 05:00 | 0 | -140 | 0 | 0 |
| 25.01.2021 05:00 - 06:00 | 0 | -140 | 0 | 0 |
| 25.01.2021 06:00 - 07:00 | 0 | 0 | 0 | 0 |
| 25.01.2021 07:00 - 08:00 | 0 | 0 | 0 | 0 |
| 25.01.2021 08:00 - 09:00 | 0 | 0 | 0 | 0 |
| 25.01.2021 09:00 - 10:00 | 0 | 0 | 0 | 0 |
| 25.01.2021 10:00 - 11:00 | 0 | 0 | 0 | 0 |
| 25.01.2021 11:00 - 12:00 | 0 | 0 | 0 | 0 |
| 25.01.2021 12:00 - 13:00 | 0 | 0 | 0 | 0 |
| 25.01.2021 13:00 - 14:00 | 0 | 0 | 0 | 0 |
| 25.01.2021 14:00 - 15:00 | 0 | 0 | 0 | 0 |
| 25.01.2021 15:00 - 16:00 | 0 | 0 | 0 | 0 |
| 25.01.2021 16:00 - 17:00 | 0 | 0 | 0 | 0 |
| 25.01.2021 17:00 - 18:00 | 0 | 0 | 0 | 0 |
| 25.01.2021 18:00 - 19:00 | 0 | 0 | 0 | 0 |
| 25.01.2021 19:00 - 20:00 | 0 | 0 | 0 | 0 |
| 25.01.2021 20:00 - 21:00 | 0 | 0 | 0 | 0 |
| 25.01.2021 21:00 - 22:00 | 0 | -80 | 0 | 0 |
| 25.01.2021 22:00 - 23:00 | 0 | -160 | 0 | 0 |
| 25.01.2021 23:00 - 24:00 | 0 | -160 | 0 | 0 |
| 26.01.2021 00:00 - 01:00 | 0 | -160 | 0 | 0 |
| 26.01.2021 01:00 - 02:00 | 0 | -160 | 0 | 0 |
| 26.01.2021 02:00 - 03:00 | 0 | -160 | 0 | 0 |
| 26.01.2021 03:00 - 04:00 | 0 | -160 | 0 | 0 |
| 26.01.2021 04:00 - 05:00 | 0 | -160 | 0 | 0 |
| 26.01.2021 05:00 - 06:00 | 0 | -160 | 0 | 0 |
| 26.01.2021 06:00 - 07:00 | 0 | 0 | 0 | 0 |
| 26.01.2021 07:00 - 08:00 | 0 | 0 | 0 | 0 |
| 26.01.2021 08:00 - 09:00 | 0 | 0 | 0 | 0 |
| 26.01.2021 09:00 - 10:00 | 0 | 0 | 0 | 0 |
| 26.01.2021 10:00 - 11:00 | 0 | 0 | 0 | 0 |
| 26.01.2021 11:00 - 12:00 | 0 | 0 | 0 | 0 |
| 26.01.2021 12:00 - 13:00 | 0 | 0 | 0 | 0 |
| 26.01.2021 13:00 - 14:00 | 0 | 0 | 0 | 0 |
| 26.01.2021 14:00 - 15:00 | 0 | 0 | 0 | 0 |
| 26.01.2021 15:00 - 16:00 | 0 | 0 | 0 | 0 |
| 26.01.2021 16:00 - 17:00 | 0 | 0 | 0 | 0 |
| 26.01.2021 17:00 - 18:00 | 0 | 0 | 0 | 0 |
| 26.01.2021 18:00 - 19:00 | 0 | 0 | 0 | 0 |
| 26.01.2021 19:00 - 20:00 | 0 | 0 | 0 | 0 |
| 26.01.2021 20:00 - 21:00 | 0 | -150 | 0 | 0 |
| 26.01.2021 21:00 - 22:00 | 0 | -150 | 0 | 0 |
| 26.01.2021 22:00 - 23:00 | 0 | -150 | 0 | 0 |
| 26.01.2021 23:00 - 24:00 | 0 | -200 | 0 | 0 |
| 27.01.2021 00:00 - 01:00 | 0 | -200 | 0 | 0 |
| 27.01.2021 01:00 - 02:00 | 0 | -200 | 0 | 0 |
| 27.01.2021 02:00 - 03:00 | 0 | -200 | 0 | 0 |
| 27.01.2021 03:00 - 04:00 | 0 | -200 | 0 | 0 |
| 27.01.2021 04:00 - 05:00 | 0 | -200 | 0 | 0 |
| 27.01.2021 05:00 - 06:00 | 0 | -200 | 0 | 0 |
| 27.01.2021 06:00 - 07:00 | 0 | 0 | 0 | 0 |
| 27.01.2021 07:00 - 08:00 | 0 | 0 | 0 | 0 |
| 27.01.2021 08:00 - 09:00 | 0 | 0 | 0 | 0 |
| 27.01.2021 09:00 - 10:00 | 0 | 0 | 0 | 0 |
| 27.01.2021 10:00 - 11:00 | 0 | 0 | 0 | 0 |
| 27.01.2021 11:00 - 12:00 | 0 | 0 | 0 | 0 |
| 27.01.2021 12:00 - 13:00 | 0 | 0 | 0 | 0 |
| 27.01.2021 13:00 - 14:00 | 0 | 0 | 0 | 0 |
| 27.01.2021 14:00 - 15:00 | 0 | 0 | 0 | 0 |
| 27.01.2021 15:00 - 16:00 | 0 | 0 | 0 | 0 |
| 27.01.2021 16:00 - 17:00 | 0 | 0 | 0 | 0 |
| 27.01.2021 17:00 - 18:00 | 0 | 0 | 0 | 0 |
| 27.01.2021 18:00 - 19:00 | 50 | 0 | 0 | 0 |
| 27.01.2021 19:00 - 20:00 | 80 | 0 | 0 | 0 |
| 27.01.2021 20:00 - 21:00 | 80 | 0 | 0 | 0 |
| 27.01.2021 21:00 - 22:00 | 80 | 0 | 0 | 0 |
| 27.01.2021 22:00 - 23:00 | 80 | 0 | 0 | 0 |
| 27.01.2021 23:00 - 24:00 | 80 | -60 | 0 | 0 |
| 28.01.2021 00:00 - 01:00 | 80 | -60 | 0 | 0 |
| 28.01.2021 01:00 - 02:00 | 80 | -160 | 0 | 0 |
| 28.01.2021 02:00 - 03:00 | 80 | -160 | 0 | 0 |
| 28.01.2021 03:00 - 04:00 | 80 | -160 | 0 | 0 |
| 28.01.2021 04:00 - 05:00 | 80 | -160 | 0 | 0 |
| 28.01.2021 05:00 - 06:00 | 80 | -160 | 0 | 0 |
| 28.01.2021 06:00 - 07:00 | 30 | 0 | 0 | 0 |
| 28.01.2021 07:00 - 08:00 | 30 | 0 | 0 | 0 |
| 28.01.2021 08:00 - 09:00 | 30 | 0 | 0 | 0 |
| 28.01.2021 09:00 - 10:00 | 30 | 0 | 0 | 0 |
| 28.01.2021 10:00 - 11:00 | 30 | 0 | 0 | 0 |
| 28.01.2021 11:00 - 12:00 | 30 | 0 | 0 | 0 |
| 28.01.2021 12:00 - 13:00 | 30 | 0 | 0 | 0 |
| 28.01.2021 13:00 - 14:00 | 30 | 0 | 0 | 0 |
| 28.01.2021 14:00 - 15:00 | 30 | 0 | 0 | 0 |
| 28.01.2021 15:00 - 16:00 | 30 | 0 | 0 | 0 |
| 28.01.2021 16:00 - 17:00 | 30 | 0 | 0 | 0 |
| 28.01.2021 17:00 - 18:00 | 30 | 0 | 0 | 0 |
| 28.01.2021 18:00 - 19:00 | 30 | 0 | 0 | 0 |
| 28.01.2021 19:00 - 20:00 | 30 | 0 | 0 | 0 |
| 28.01.2021 20:00 - 21:00 | 30 | 0 | 0 | 0 |
| 28.01.2021 21:00 - 22:00 | 30 | 0 | 0 | 0 |
| 28.01.2021 22:00 - 23:00 | 30 | 0 | 0 | 0 |
| 28.01.2021 23:00 - 24:00 | 30 | 0 | 0 | 0 |
| 29.01.2021 00:00 - 01:00 | 30 | 0 | 0 | 0 |
| 29.01.2021 01:00 - 02:00 | 30 | -30 | 0 | 0 |
| 29.01.2021 02:00 - 03:00 | 30 | -30 | 0 | 0 |
| 29.01.2021 03:00 - 04:00 | 30 | -30 | 0 | 0 |
| 29.01.2021 04:00 - 05:00 | 30 | -30 | 0 | 0 |
| 29.01.2021 05:00 - 06:00 | 30 | -30 | 0 | 0 |
| 29.01.2021 06:00 - 07:00 | 0 | 0 | 0 | 0 |
| 29.01.2021 07:00 - 08:00 | 0 | 0 | 0 | 0 |
| 29.01.2021 08:00 - 09:00 | 0 | 0 | 0 | 0 |
| 29.01.2021 09:00 - 10:00 | 0 | 0 | 0 | 0 |
| 29.01.2021 10:00 - 11:00 | 0 | 0 | 0 | 0 |
| 29.01.2021 11:00 - 12:00 | 0 | 0 | 0 | 0 |
| 29.01.2021 12:00 - 13:00 | 0 | 0 | 0 | 0 |
| 29.01.2021 13:00 - 14:00 | 0 | 0 | 0 | 0 |
| 29.01.2021 14:00 - 15:00 | 0 | 0 | 0 | 0 |
| 29.01.2021 15:00 - 16:00 | 0 | 0 | 0 | 0 |
| 29.01.2021 16:00 - 17:00 | 0 | 0 | 0 | 0 |
| 29.01.2021 17:00 - 18:00 | 0 | -20 | 0 | 0 |
| 29.01.2021 18:00 - 19:00 | 0 | -20 | 0 | 0 |
| 29.01.2021 19:00 - 20:00 | 0 | -20 | 0 | 0 |
| 29.01.2021 20:00 - 21:00 | 0 | -50 | 0 | 0 |
| 29.01.2021 21:00 - 22:00 | 0 | -50 | 0 | 0 |
| 29.01.2021 22:00 - 23:00 | 0 | -150 | 0 | 0 |
| 29.01.2021 23:00 - 24:00 | 0 | -150 | 0 | 0 |
| 30.01.2021 00:00 - 01:00 | 0 | -200 | 0 | 0 |
| 30.01.2021 01:00 - 02:00 | 0 | -260 | 0 | 0 |
| 30.01.2021 02:00 - 03:00 | 0 | -260 | 0 | 0 |
| 30.01.2021 03:00 - 04:00 | 0 | -260 | 0 | 0 |
| 30.01.2021 04:00 - 05:00 | 0 | -260 | 0 | 0 |
| 30.01.2021 05:00 - 06:00 | 0 | -260 | 0 | 0 |
| 30.01.2021 06:00 - 07:00 | 0 | 0 | 0 | 0 |
| 30.01.2021 07:00 - 08:00 | 0 | 0 | 0 | 0 |
| 30.01.2021 08:00 - 09:00 | 0 | 0 | 0 | 0 |
| 30.01.2021 09:00 - 10:00 | 0 | 0 | 0 | 0 |
| 30.01.2021 10:00 - 11:00 | 0 | 0 | 0 | 0 |
| 30.01.2021 11:00 - 12:00 | 0 | 0 | 0 | 0 |
| 30.01.2021 12:00 - 13:00 | 0 | 0 | 0 | 0 |
| 30.01.2021 13:00 - 14:00 | 0 | 0 | 0 | 0 |
| 30.01.2021 14:00 - 15:00 | 0 | 0 | 0 | 0 |
| 30.01.2021 15:00 - 16:00 | 0 | 0 | 0 | 0 |
| 30.01.2021 16:00 - 17:00 | 0 | 0 | 0 | 0 |
| 30.01.2021 17:00 - 18:00 | 0 | 0 | 0 | 0 |
| 30.01.2021 18:00 - 19:00 | 0 | 0 | 0 | 0 |
| 30.01.2021 19:00 - 20:00 | 0 | 0 | 0 | 0 |
| 30.01.2021 20:00 - 21:00 | 0 | 0 | 0 | 0 |
| 30.01.2021 21:00 - 22:00 | 0 | 0 | 0 | 0 |
| 30.01.2021 22:00 - 23:00 | 0 | 0 | 0 | 0 |
| 30.01.2021 23:00 - 24:00 | 0 | 0 | 0 | 0 |
| 31.01.2021 00:00 - 01:00 | 0 | 0 | 0 | 0 |
| 31.01.2021 01:00 - 02:00 | 0 | 0 | 0 | 0 |
| 31.01.2021 02:00 - 03:00 | 0 | 0 | 0 | 0 |
| 31.01.2021 03:00 - 04:00 | 0 | 0 | 0 | 0 |
| 31.01.2021 04:00 - 05:00 | 0 | 0 | 0 | 0 |
| 31.01.2021 05:00 - 06:00 | 0 | 0 | 0 | 0 |
| 31.01.2021 06:00 - 07:00 | 0 | 0 | 0 | 0 |
| 31.01.2021 07:00 - 08:00 | 0 | 0 | 0 | 0 |
| 31.01.2021 08:00 - 09:00 | 0 | 0 | 0 | 0 |
| 31.01.2021 09:00 - 10:00 | 0 | 0 | 0 | 0 |
| 31.01.2021 10:00 - 11:00 | 0 | 0 | 0 | 0 |
| 31.01.2021 11:00 - 12:00 | 0 | 0 | 0 | 0 |
| 31.01.2021 12:00 - 13:00 | 0 | -20 | 0 | 0 |
| 31.01.2021 13:00 - 14:00 | 0 | -70 | 0 | 0 |
| 31.01.2021 14:00 - 15:00 | 0 | -70 | 0 | 0 |
| 31.01.2021 15:00 - 16:00 | 0 | -70 | 0 | 0 |
| 31.01.2021 16:00 - 17:00 | 0 | -70 | 0 | 0 |
| 31.01.2021 17:00 - 18:00 | 0 | -70 | 0 | 0 |
| 31.01.2021 18:00 - 19:00 | 0 | -70 | 0 | 0 |
| 31.01.2021 19:00 - 20:00 | 0 | -100 | 0 | 0 |
| 31.01.2021 20:00 - 21:00 | 0 | -100 | 0 | 0 |
| 31.01.2021 21:00 - 22:00 | 0 | -100 | 0 | 0 |
| 31.01.2021 22:00 - 23:00 | 0 | -150 | 0 | 0 |
| 31.01.2021 23:00 - 24:00 | 0 | -150 | 0 | 0 |
| 01.02.2021 00:00 - 01:00 | 0 | -150 | 0 | 0 |
| 01.02.2021 01:00 - 02:00 | 0 | -150 | 0 | 0 |
| 01.02.2021 02:00 - 03:00 | 0 | -150 | 0 | 0 |
| 01.02.2021 03:00 - 04:00 | 0 | -150 | 0 | 0 |
| 01.02.2021 04:00 - 05:00 | 0 | -150 | 0 | 0 |
| 01.02.2021 05:00 - 06:00 | 0 | -150 | 0 | 0 |